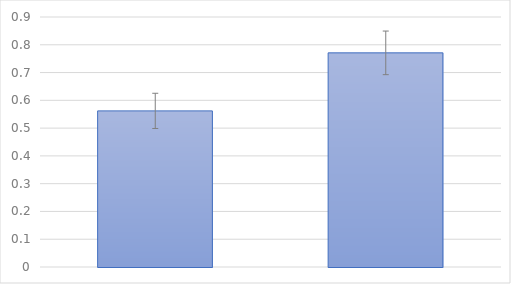
| Category | Series 0 |
|---|---|
| 0 | 0.562 |
| 1 | 0.771 |